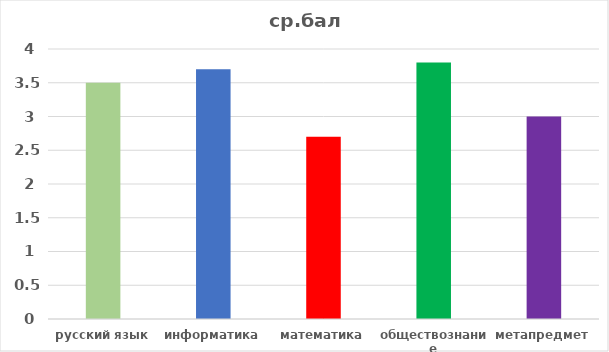
| Category | ср.балл |
|---|---|
| русский язык | 3.5 |
| информатика | 3.7 |
| математика | 2.7 |
| обществознание | 3.8 |
| метапредмет | 3 |